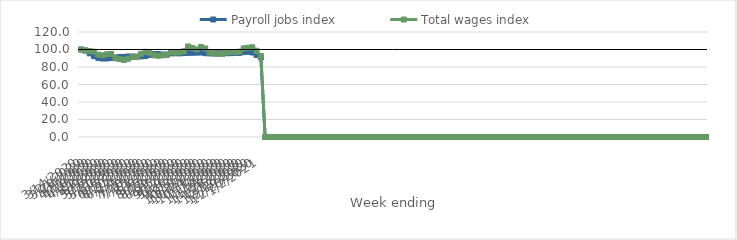
| Category | Payroll jobs index | Total wages index |
|---|---|---|
| 14/03/2020 | 100 | 100 |
| 21/03/2020 | 98.698 | 98.991 |
| 28/03/2020 | 95.584 | 98.128 |
| 04/04/2020 | 92.39 | 97.477 |
| 11/04/2020 | 90.482 | 94.132 |
| 18/04/2020 | 89.717 | 93.283 |
| 25/04/2020 | 89.737 | 94.484 |
| 02/05/2020 | 90.193 | 94.972 |
| 09/05/2020 | 90.869 | 89.896 |
| 16/05/2020 | 91.273 | 89.095 |
| 23/05/2020 | 91.541 | 87.975 |
| 30/05/2020 | 91.979 | 89.444 |
| 06/06/2020 | 91.785 | 91.954 |
| 13/06/2020 | 91.922 | 91.579 |
| 20/06/2020 | 92.145 | 94.986 |
| 27/06/2020 | 92.553 | 97.336 |
| 04/07/2020 | 93.898 | 96.348 |
| 11/07/2020 | 94.706 | 93.332 |
| 18/07/2020 | 94.778 | 92.896 |
| 25/07/2020 | 94.263 | 93.337 |
| 01/08/2020 | 94.265 | 93.802 |
| 08/08/2020 | 95.625 | 96.898 |
| 15/08/2020 | 95.668 | 96.585 |
| 22/08/2020 | 95.589 | 96.814 |
| 29/08/2020 | 95.91 | 97.938 |
| 05/09/2020 | 96.148 | 103.46 |
| 12/09/2020 | 96.258 | 101.771 |
| 19/09/2020 | 96.473 | 100.063 |
| 26/09/2020 | 96.539 | 102.928 |
| 03/10/2020 | 95.83 | 101.248 |
| 10/10/2020 | 95.544 | 96.597 |
| 17/10/2020 | 95.42 | 95.661 |
| 24/10/2020 | 95.785 | 94.996 |
| 31/10/2020 | 95.615 | 95.145 |
| 07/11/2020 | 95.71 | 96.663 |
| 14/11/2020 | 95.827 | 97.163 |
| 21/11/2020 | 96.092 | 97.032 |
| 28/11/2020 | 96.137 | 97.511 |
| 05/12/2020 | 97.03 | 101.314 |
| 12/12/2020 | 97.42 | 102.011 |
| 19/12/2020 | 96.547 | 102.529 |
| 26/12/2020 | 93.709 | 98.582 |
| 02/01/2021 | 91.13 | 92.647 |